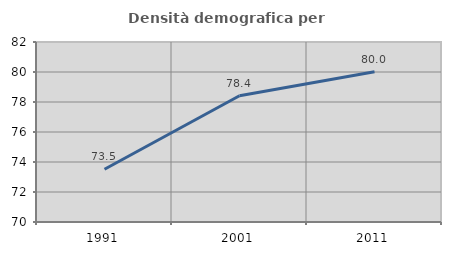
| Category | Densità demografica |
|---|---|
| 1991.0 | 73.514 |
| 2001.0 | 78.413 |
| 2011.0 | 80.016 |